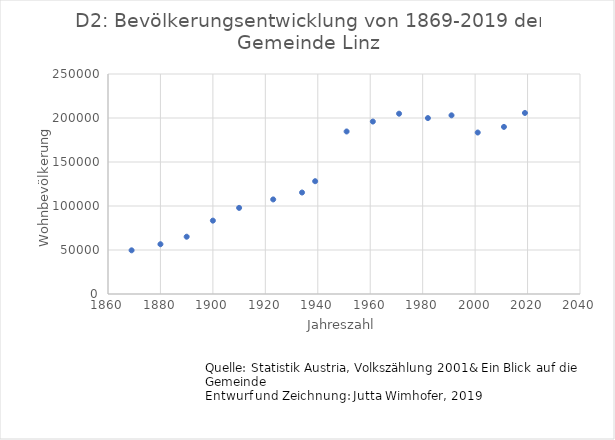
| Category | Series 0 |
|---|---|
| 1869.0 | 49635 |
| 1880.0 | 56569 |
| 1890.0 | 65090 |
| 1900.0 | 83356 |
| 1910.0 | 97852 |
| 1923.0 | 107463 |
| 1934.0 | 115328 |
| 1939.0 | 128177 |
| 1951.0 | 184685 |
| 1961.0 | 195978 |
| 1971.0 | 204889 |
| 1982.0 | 199910 |
| 1991.0 | 203044 |
| 2001.0 | 183504 |
| 2011.0 | 189889 |
| 2019.0 | 205726 |